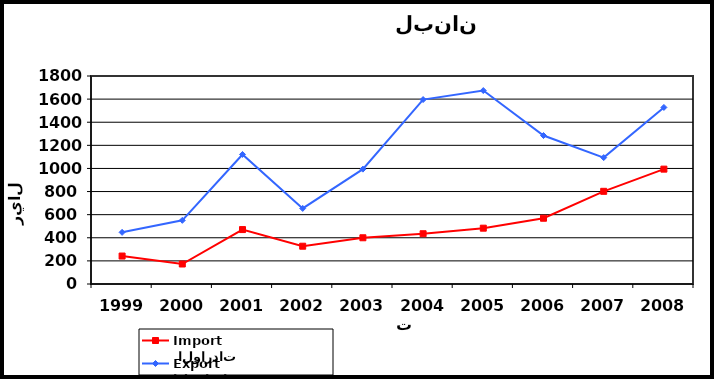
| Category |  الواردات           Import | الصادرات          Export |
|---|---|---|
| 1999.0 | 242 | 447 |
| 2000.0 | 173 | 551 |
| 2001.0 | 471 | 1121 |
| 2002.0 | 327 | 654 |
| 2003.0 | 400 | 994 |
| 2004.0 | 435 | 1596 |
| 2005.0 | 483 | 1674 |
| 2006.0 | 569 | 1285 |
| 2007.0 | 802 | 1094 |
| 2008.0 | 994 | 1528 |